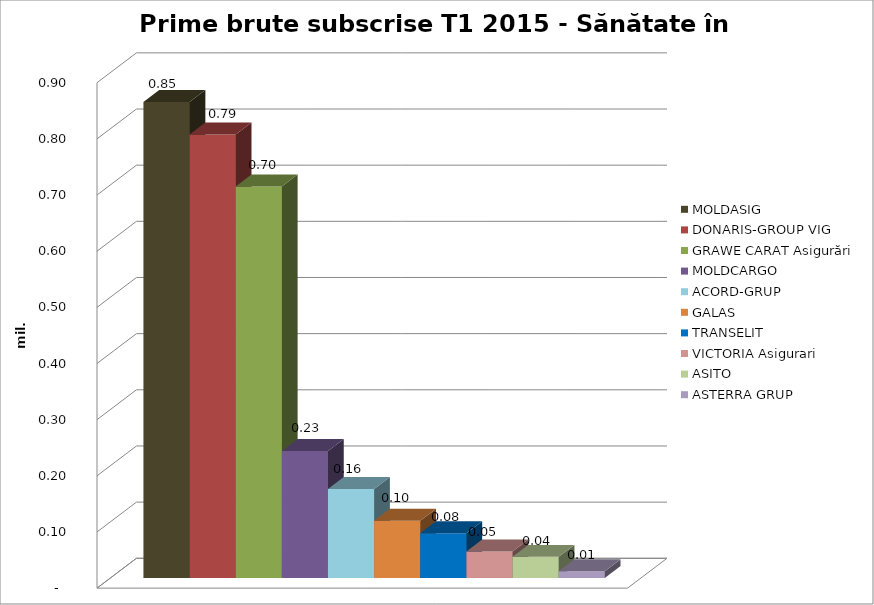
| Category | MOLDASIG  | DONARIS-GROUP VIG | GRAWE CARAT Asigurări | MOLDCARGO  | ACORD-GRUP  | GALAS  | TRANSELIT  | VICTORIA Asigurari  | ASITO  | ASTERRA GRUP  |
|---|---|---|---|---|---|---|---|---|---|---|
| 0 | 0.848 | 0.79 | 0.697 | 0.226 | 0.158 | 0.102 | 0.08 | 0.047 | 0.038 | 0.012 |